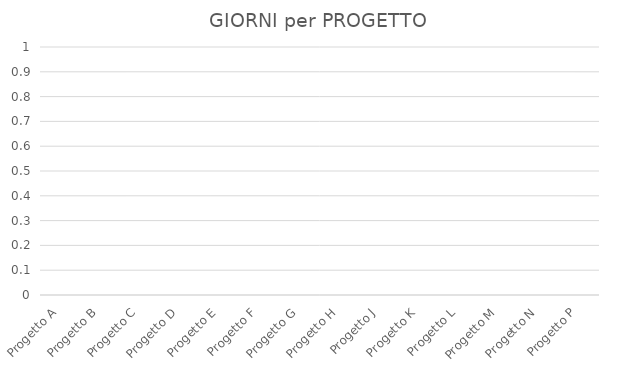
| Category | N. di GIORNI |
|---|---|
| Progetto A | 0 |
| Progetto B | 0 |
| Progetto C | 0 |
| Progetto D | 0 |
| Progetto E | 0 |
| Progetto F | 0 |
| Progetto G | 0 |
| Progetto H | 0 |
| Progetto J | 0 |
| Progetto K | 0 |
| Progetto L | 0 |
| Progetto M | 0 |
| Progetto N | 0 |
| Progetto P | 0 |